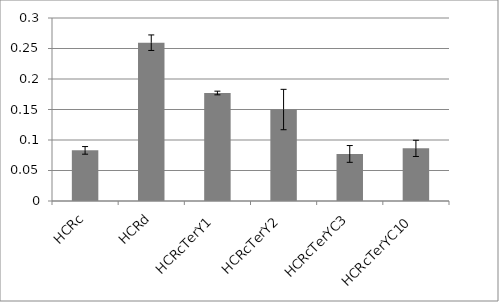
| Category | Series 0 |
|---|---|
| HCRc | 0.083 |
| HCRd | 0.26 |
| HCRcTerY1 | 0.177 |
| HCRcTerY2 | 0.15 |
| HCRcTerYC3 | 0.077 |
| HCRcTerYC10 | 0.086 |